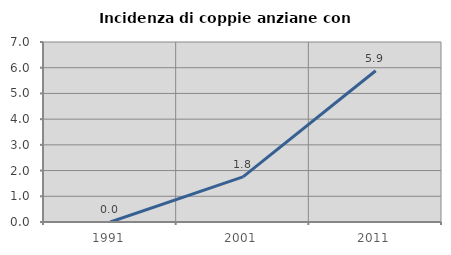
| Category | Incidenza di coppie anziane con figli |
|---|---|
| 1991.0 | 0 |
| 2001.0 | 1.754 |
| 2011.0 | 5.882 |